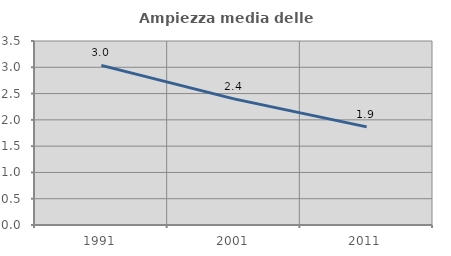
| Category | Ampiezza media delle famiglie |
|---|---|
| 1991.0 | 3.036 |
| 2001.0 | 2.399 |
| 2011.0 | 1.866 |